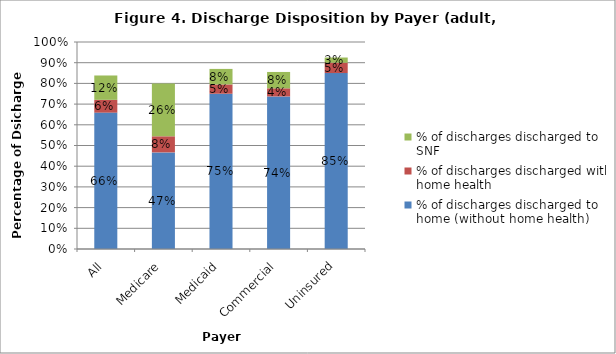
| Category | % of discharges discharged to home (without home health) | % of discharges discharged with home health | % of discharges discharged to SNF |
|---|---|---|---|
| All | 0.659 | 0.062 | 0.118 |
| Medicare | 0.467 | 0.078 | 0.256 |
| Medicaid | 0.75 | 0.045 | 0.075 |
| Commercial | 0.737 | 0.039 | 0.079 |
| Uninsured | 0.85 | 0.05 | 0.025 |